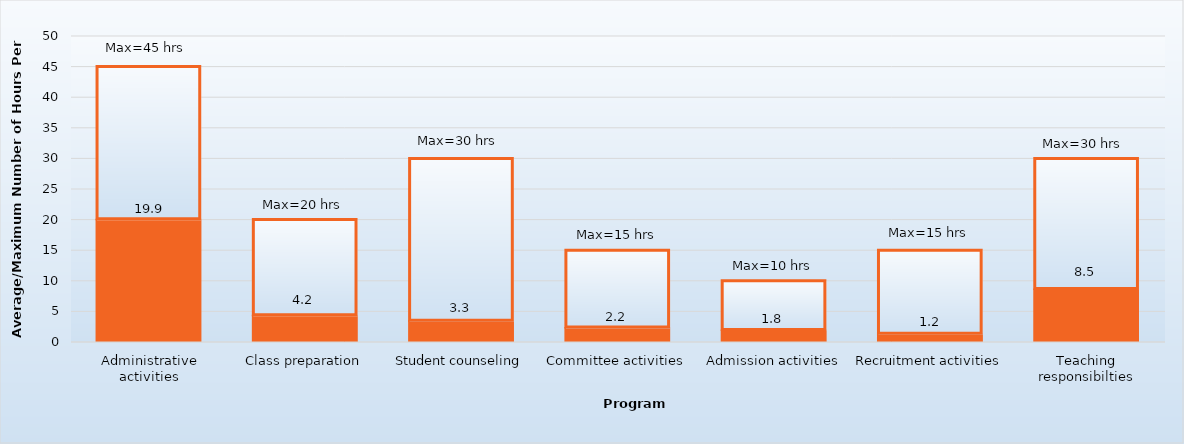
| Category | Average hours per week | Maximum |
|---|---|---|
| Administrative activities | 19.9 | 25.1 |
| Class preparation | 4.2 | 15.8 |
| Student counseling | 3.3 | 26.7 |
| Committee activities | 2.2 | 12.8 |
| Admission activities | 1.8 | 8.2 |
| Recruitment activities | 1.2 | 13.8 |
| Teaching responsibilties | 8.5 | 21.5 |